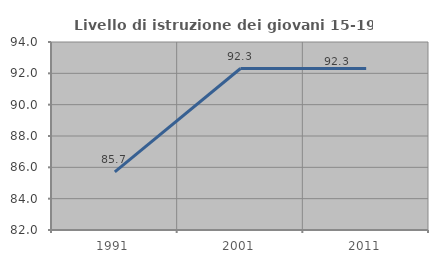
| Category | Livello di istruzione dei giovani 15-19 anni |
|---|---|
| 1991.0 | 85.714 |
| 2001.0 | 92.308 |
| 2011.0 | 92.308 |